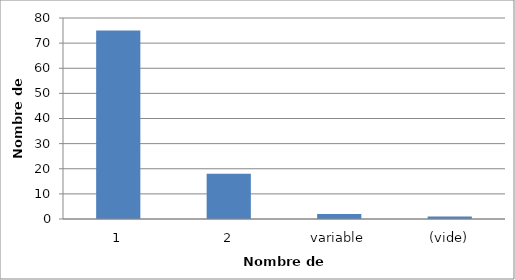
| Category | Total |
|---|---|
| 1 | 75 |
| 2 | 18 |
| variable | 2 |
| (vide) | 1 |